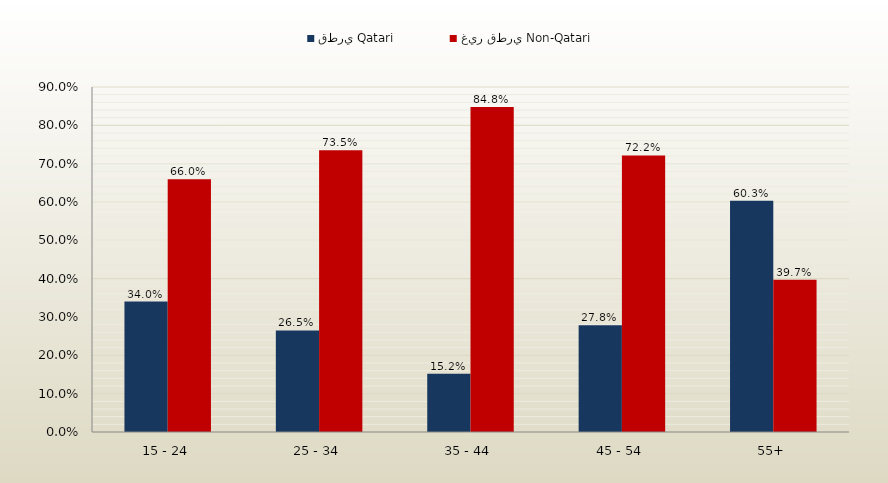
| Category | قطري Qatari | غير قطري Non-Qatari |
|---|---|---|
| 15 - 24 | 0.34 | 0.66 |
| 25 - 34 | 0.265 | 0.735 |
| 35 - 44 | 0.152 | 0.848 |
| 45 - 54 | 0.278 | 0.722 |
| 55+ | 0.603 | 0.397 |